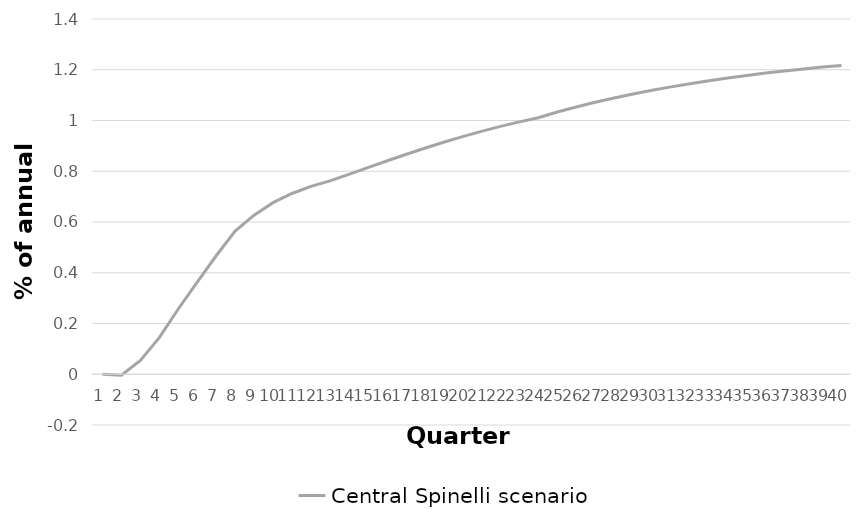
| Category | Central Spinelli scenario |
|---|---|
| 0 | 0 |
| 1 | -0.004 |
| 2 | 0.055 |
| 3 | 0.144 |
| 4 | 0.257 |
| 5 | 0.363 |
| 6 | 0.467 |
| 7 | 0.564 |
| 8 | 0.627 |
| 9 | 0.676 |
| 10 | 0.712 |
| 11 | 0.74 |
| 12 | 0.762 |
| 13 | 0.788 |
| 14 | 0.814 |
| 15 | 0.84 |
| 16 | 0.866 |
| 17 | 0.891 |
| 18 | 0.914 |
| 19 | 0.936 |
| 20 | 0.957 |
| 21 | 0.977 |
| 22 | 0.995 |
| 23 | 1.011 |
| 24 | 1.033 |
| 25 | 1.053 |
| 26 | 1.072 |
| 27 | 1.089 |
| 28 | 1.104 |
| 29 | 1.119 |
| 30 | 1.133 |
| 31 | 1.145 |
| 32 | 1.157 |
| 33 | 1.168 |
| 34 | 1.178 |
| 35 | 1.187 |
| 36 | 1.195 |
| 37 | 1.203 |
| 38 | 1.211 |
| 39 | 1.217 |